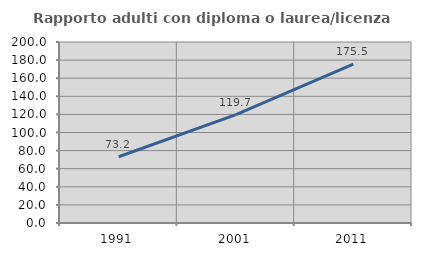
| Category | Rapporto adulti con diploma o laurea/licenza media  |
|---|---|
| 1991.0 | 73.22 |
| 2001.0 | 119.733 |
| 2011.0 | 175.533 |